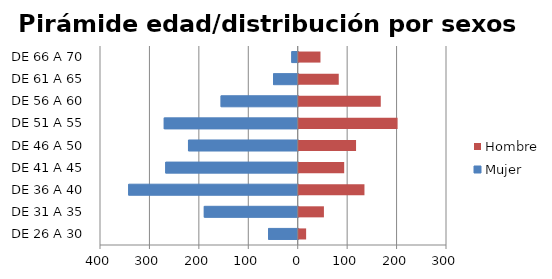
| Category | Mujer | Hombre |
|---|---|---|
| DE 26 A 30 | -60 | 15 |
| DE 31 A 35 | -190 | 51 |
| DE 36 A 40 | -343 | 133 |
| DE 41 A 45 | -268 | 92 |
| DE 46 A 50 | -222 | 116 |
| DE 51 A 55 | -271 | 200 |
| DE 56 A 60 | -156 | 166 |
| DE 61 A 65 | -50 | 81 |
| DE 66 A 70 | -13 | 44 |